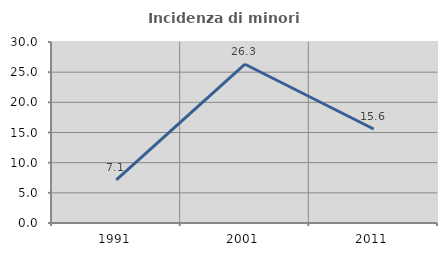
| Category | Incidenza di minori stranieri |
|---|---|
| 1991.0 | 7.143 |
| 2001.0 | 26.316 |
| 2011.0 | 15.584 |